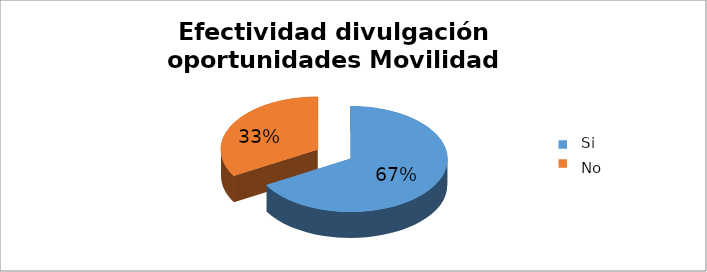
| Category | Series 0 |
|---|---|
| 0 | 0.667 |
| 1 | 0.333 |